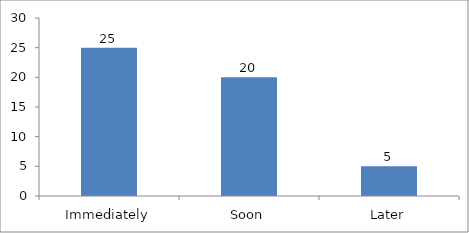
| Category | When would you like to begin your changemaking journey?  |
|---|---|
| Immediately | 25 |
| Soon | 20 |
| Later | 5 |